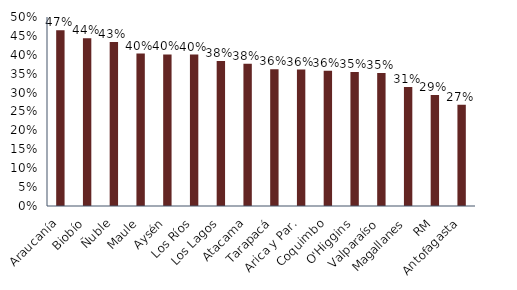
| Category | 60 + |
|---|---|
| Araucanía | 0.465 |
| Biobío | 0.444 |
| Ñuble | 0.434 |
| Maule | 0.403 |
| Aysén | 0.401 |
| Los Ríos | 0.4 |
| Los Lagos | 0.384 |
| Atacama | 0.376 |
| Tarapacá | 0.362 |
| Arica y Par. | 0.361 |
| Coquimbo | 0.358 |
| O'Higgins | 0.355 |
| Valparaíso | 0.352 |
| Magallanes | 0.315 |
| RM | 0.294 |
| Antofagasta | 0.268 |